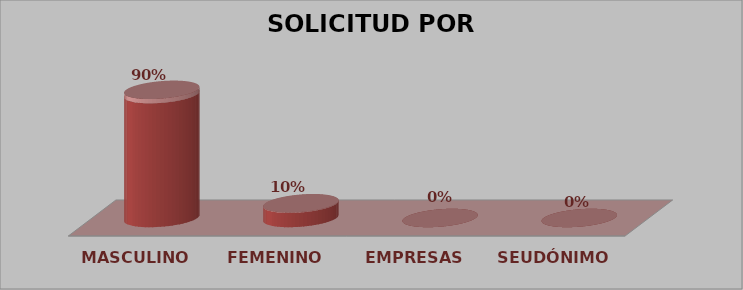
| Category | SOLICITUD POR GÉNERO | Series 1 |
|---|---|---|
| MASCULINO | 26 | 0.897 |
| FEMENINO | 3 | 0.103 |
| EMPRESAS | 0 | 0 |
| SEUDÓNIMO | 0 | 0 |